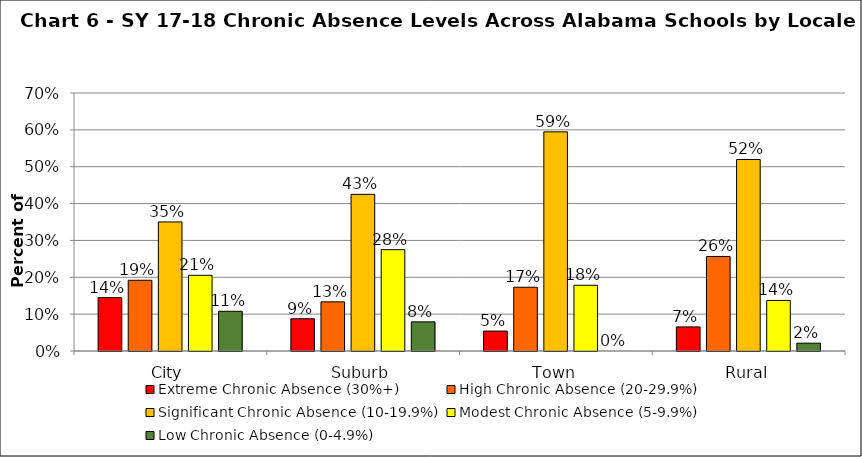
| Category | Extreme Chronic Absence (30%+) | High Chronic Absence (20-29.9%) | Significant Chronic Absence (10-19.9%) | Modest Chronic Absence (5-9.9%) | Low Chronic Absence (0-4.9%) |
|---|---|---|---|---|---|
| 0 | 0.145 | 0.192 | 0.35 | 0.205 | 0.108 |
| 1 | 0.088 | 0.133 | 0.425 | 0.275 | 0.079 |
| 2 | 0.054 | 0.173 | 0.595 | 0.178 | 0 |
| 3 | 0.065 | 0.257 | 0.52 | 0.137 | 0.021 |